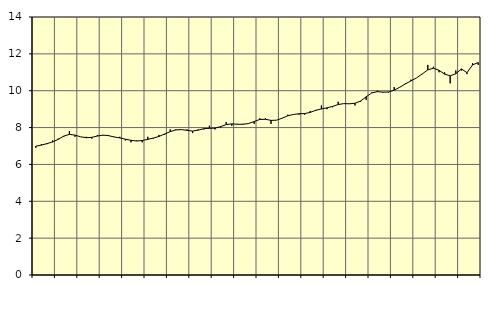
| Category | Piggar | Offentlig förvaltning m.m., SNI 84, 99 |
|---|---|---|
| nan | 6.9 | 6.99 |
| 1.0 | 7.1 | 7.05 |
| 1.0 | 7.1 | 7.13 |
| 1.0 | 7.3 | 7.22 |
| nan | 7.4 | 7.36 |
| 2.0 | 7.5 | 7.54 |
| 2.0 | 7.8 | 7.63 |
| 2.0 | 7.5 | 7.59 |
| nan | 7.5 | 7.5 |
| 3.0 | 7.5 | 7.45 |
| 3.0 | 7.4 | 7.47 |
| 3.0 | 7.6 | 7.54 |
| nan | 7.6 | 7.59 |
| 4.0 | 7.6 | 7.56 |
| 4.0 | 7.5 | 7.49 |
| 4.0 | 7.5 | 7.44 |
| nan | 7.3 | 7.37 |
| 5.0 | 7.2 | 7.31 |
| 5.0 | 7.3 | 7.27 |
| 5.0 | 7.2 | 7.3 |
| nan | 7.5 | 7.36 |
| 6.0 | 7.4 | 7.43 |
| 6.0 | 7.6 | 7.52 |
| 6.0 | 7.6 | 7.65 |
| nan | 7.9 | 7.78 |
| 7.0 | 7.9 | 7.87 |
| 7.0 | 7.9 | 7.89 |
| 7.0 | 7.9 | 7.85 |
| nan | 7.7 | 7.81 |
| 8.0 | 7.9 | 7.86 |
| 8.0 | 7.9 | 7.94 |
| 8.0 | 8.1 | 7.96 |
| nan | 7.9 | 7.97 |
| 9.0 | 8 | 8.05 |
| 9.0 | 8.3 | 8.16 |
| 9.0 | 8.1 | 8.2 |
| nan | 8.2 | 8.18 |
| 10.0 | 8.2 | 8.18 |
| 10.0 | 8.2 | 8.22 |
| 10.0 | 8.2 | 8.33 |
| nan | 8.5 | 8.44 |
| 11.0 | 8.5 | 8.45 |
| 11.0 | 8.2 | 8.39 |
| 11.0 | 8.4 | 8.4 |
| nan | 8.5 | 8.51 |
| 12.0 | 8.7 | 8.64 |
| 12.0 | 8.7 | 8.71 |
| 12.0 | 8.7 | 8.75 |
| nan | 8.7 | 8.76 |
| 13.0 | 8.9 | 8.82 |
| 13.0 | 8.9 | 8.94 |
| 13.0 | 9.2 | 9.01 |
| nan | 9 | 9.07 |
| 14.0 | 9.1 | 9.15 |
| 14.0 | 9.4 | 9.25 |
| 14.0 | 9.3 | 9.3 |
| nan | 9.3 | 9.29 |
| 15.0 | 9.2 | 9.32 |
| 15.0 | 9.4 | 9.44 |
| 15.0 | 9.5 | 9.67 |
| nan | 9.9 | 9.88 |
| 16.0 | 10 | 9.95 |
| 16.0 | 9.9 | 9.92 |
| 16.0 | 9.9 | 9.93 |
| nan | 10.2 | 10.03 |
| 17.0 | 10.2 | 10.19 |
| 17.0 | 10.4 | 10.37 |
| 17.0 | 10.6 | 10.53 |
| nan | 10.7 | 10.7 |
| 18.0 | 10.9 | 10.91 |
| 18.0 | 11.4 | 11.13 |
| 18.0 | 11.3 | 11.22 |
| nan | 11 | 11.11 |
| 19.0 | 11 | 10.9 |
| 19.0 | 10.4 | 10.81 |
| 19.0 | 11.1 | 10.92 |
| nan | 11.1 | 11.18 |
| 20.0 | 10.9 | 10.98 |
| 20.0 | 11.5 | 11.4 |
| 20.0 | 11.4 | 11.53 |